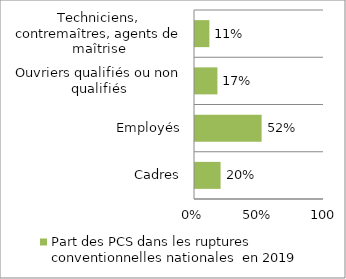
| Category | Part des PCS dans les ruptures conventionnelles nationales  en 2019 |
|---|---|
| Cadres | 0.198 |
| Employés | 0.516 |
| Ouvriers qualifiés ou non qualifiés | 0.174 |
| Techniciens, contremaîtres, agents de maîtrise | 0.111 |